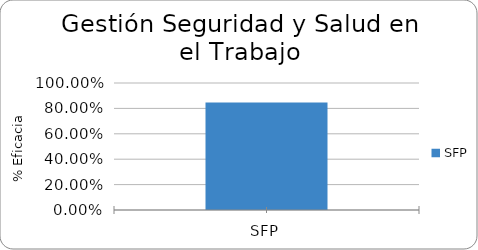
| Category | % Eficacia total |
|---|---|
| SFP | 0.846 |